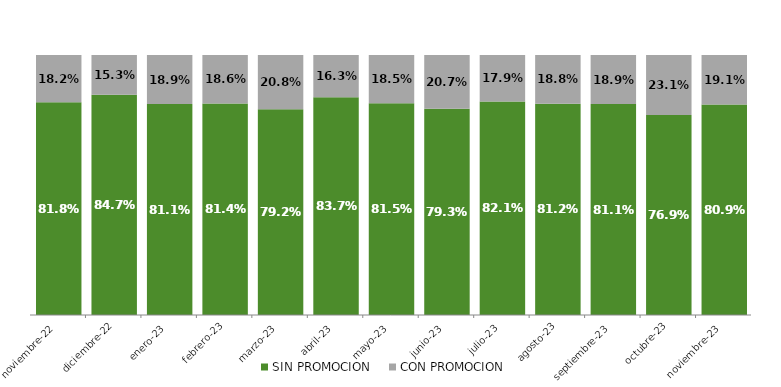
| Category | SIN PROMOCION   | CON PROMOCION   |
|---|---|---|
| 2022-11-01 | 0.818 | 0.182 |
| 2022-12-01 | 0.847 | 0.153 |
| 2023-01-01 | 0.811 | 0.189 |
| 2023-02-01 | 0.814 | 0.186 |
| 2023-03-01 | 0.792 | 0.208 |
| 2023-04-01 | 0.837 | 0.163 |
| 2023-05-01 | 0.815 | 0.185 |
| 2023-06-01 | 0.793 | 0.207 |
| 2023-07-01 | 0.821 | 0.179 |
| 2023-08-01 | 0.812 | 0.188 |
| 2023-09-01 | 0.811 | 0.189 |
| 2023-10-01 | 0.769 | 0.231 |
| 2023-11-01 | 0.809 | 0.191 |